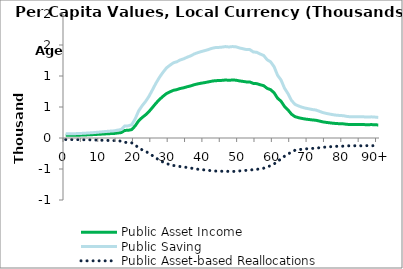
| Category | Public Asset Income | Public Saving | Public Asset-based Reallocations |
|---|---|---|---|
| 0 | 43.291 | 68.26 | -24.969 |
|  | 43.974 | 69.336 | -25.362 |
| 2 | 44.114 | 69.557 | -25.443 |
| 3 | 44.788 | 70.619 | -25.832 |
| 4 | 45.783 | 72.189 | -26.406 |
| 5 | 47.964 | 75.628 | -27.664 |
| 6 | 50.038 | 78.897 | -28.86 |
| 7 | 52.407 | 82.633 | -30.226 |
| 8 | 54.978 | 86.687 | -31.709 |
| 9 | 58.265 | 91.869 | -33.604 |
| 10 | 61.458 | 96.905 | -35.446 |
| 11 | 64.731 | 102.065 | -37.334 |
| 12 | 68.053 | 107.302 | -39.25 |
| 13 | 70.996 | 111.943 | -40.947 |
| 14 | 73.327 | 115.618 | -42.291 |
| 15 | 80.877 | 127.523 | -46.646 |
| 16 | 87.131 | 137.385 | -50.253 |
| 17 | 122.233 | 192.731 | -70.498 |
| 18 | 124.362 | 196.088 | -71.726 |
| 19 | 135.146 | 213.091 | -77.946 |
| 20 | 195.864 | 308.829 | -112.965 |
| 21 | 277.359 | 437.327 | -159.968 |
| 22 | 330.11 | 520.502 | -190.392 |
| 23 | 373.971 | 589.661 | -215.69 |
| 24 | 428.047 | 674.926 | -246.878 |
| 25 | 494.076 | 779.037 | -284.961 |
| 26 | 561.844 | 885.89 | -324.046 |
| 27 | 621.169 | 979.431 | -358.262 |
| 28 | 671.619 | 1058.979 | -387.359 |
| 29 | 716.557 | 1129.834 | -413.277 |
| 30 | 744.191 | 1173.407 | -429.216 |
| 31 | 768.928 | 1212.41 | -443.482 |
| 32 | 780.162 | 1230.124 | -449.962 |
| 33 | 798.842 | 1259.577 | -460.736 |
| 34 | 810.3 | 1277.644 | -467.344 |
| 35 | 826.965 | 1303.921 | -476.956 |
| 36 | 840.362 | 1325.045 | -484.683 |
| 37 | 859.51 | 1355.237 | -495.726 |
| 38 | 872.725 | 1376.072 | -503.348 |
| 39 | 883.881 | 1393.663 | -509.782 |
| 40 | 893.463 | 1408.772 | -515.309 |
| 41 | 903.832 | 1425.121 | -521.289 |
| 42 | 916.047 | 1444.381 | -528.334 |
| 43 | 924.356 | 1457.483 | -533.127 |
| 44 | 926.294 | 1460.538 | -534.244 |
| 45 | 929.7 | 1465.908 | -536.208 |
| 46 | 935.232 | 1474.631 | -539.399 |
| 47 | 930.994 | 1467.949 | -536.955 |
| 48 | 935.22 | 1474.612 | -539.392 |
| 49 | 932.828 | 1470.84 | -538.012 |
| 50 | 921.275 | 1452.624 | -531.349 |
| 51 | 913.378 | 1440.173 | -526.795 |
| 52 | 904.719 | 1426.52 | -521.801 |
| 53 | 904.118 | 1425.571 | -521.454 |
| 54 | 880.598 | 1388.487 | -507.889 |
| 55 | 876.55 | 1382.105 | -505.554 |
| 56 | 859.001 | 1354.433 | -495.432 |
| 57 | 843.926 | 1330.664 | -486.738 |
| 58 | 800.49 | 1262.175 | -461.686 |
| 59 | 778.808 | 1227.989 | -449.181 |
| 60 | 729.414 | 1150.107 | -420.693 |
| 61 | 641.88 | 1012.087 | -370.207 |
| 62 | 593.163 | 935.272 | -342.109 |
| 63 | 509.66 | 803.609 | -293.949 |
| 64 | 453.379 | 714.867 | -261.488 |
| 65 | 384.938 | 606.953 | -222.015 |
| 66 | 344.619 | 543.379 | -198.76 |
| 67 | 328.136 | 517.39 | -189.254 |
| 68 | 315.324 | 497.189 | -181.865 |
| 69 | 305.346 | 481.456 | -176.11 |
| 70 | 298.656 | 470.907 | -172.251 |
| 71 | 291.13 | 459.041 | -167.911 |
| 72 | 286.423 | 451.619 | -165.196 |
| 73 | 273.871 | 431.828 | -157.956 |
| 74 | 260.474 | 410.703 | -150.229 |
| 75 | 251.793 | 397.016 | -145.223 |
| 76 | 244.86 | 386.084 | -141.224 |
| 77 | 237.945 | 375.18 | -137.236 |
| 78 | 232.906 | 367.235 | -134.329 |
| 79 | 230.365 | 363.229 | -132.864 |
| 80 | 227.82 | 359.216 | -131.396 |
| 81 | 220.467 | 347.622 | -127.155 |
| 82 | 217.084 | 342.288 | -125.204 |
| 83 | 216.999 | 342.154 | -125.155 |
| 84 | 216.927 | 342.041 | -125.114 |
| 85 | 218.559 | 344.614 | -126.055 |
| 86 | 215.857 | 340.353 | -124.496 |
| 87 | 214.072 | 337.54 | -123.467 |
| 88 | 216.397 | 341.205 | -124.808 |
| 89 | 214.049 | 337.502 | -123.454 |
| 90+ | 210.324 | 331.629 | -121.305 |